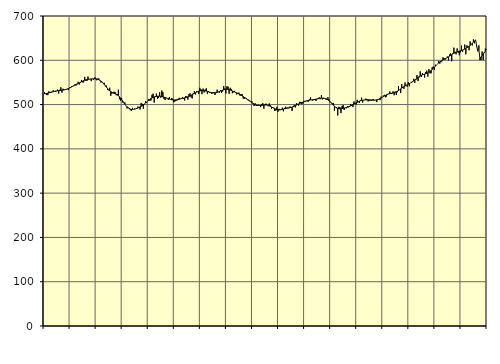
| Category | Piggar | Series 1 |
|---|---|---|
| nan | 527.8 | 524.2 |
| 87.0 | 525 | 524.54 |
| 87.0 | 521.6 | 525.27 |
| 87.0 | 521.3 | 525.8 |
| 87.0 | 529.9 | 526.46 |
| 87.0 | 526.2 | 527.11 |
| 87.0 | 528.8 | 527.82 |
| 87.0 | 528.1 | 528.49 |
| 87.0 | 532.4 | 529.15 |
| 87.0 | 529.6 | 529.76 |
| 87.0 | 528.7 | 530.31 |
| 87.0 | 530.2 | 530.78 |
| nan | 533.8 | 531.17 |
| 88.0 | 525 | 531.51 |
| 88.0 | 533.5 | 531.82 |
| 88.0 | 539 | 532.13 |
| 88.0 | 526.9 | 532.44 |
| 88.0 | 535.8 | 532.77 |
| 88.0 | 532.7 | 533.17 |
| 88.0 | 533 | 533.68 |
| 88.0 | 533.9 | 534.32 |
| 88.0 | 535.7 | 535.12 |
| 88.0 | 532.5 | 536.12 |
| 88.0 | 538.2 | 537.27 |
| nan | 538 | 538.55 |
| 89.0 | 541.4 | 539.95 |
| 89.0 | 542 | 541.36 |
| 89.0 | 543.3 | 542.73 |
| 89.0 | 545.7 | 544.05 |
| 89.0 | 542.9 | 545.33 |
| 89.0 | 545.6 | 546.55 |
| 89.0 | 551.4 | 547.77 |
| 89.0 | 545.3 | 549.01 |
| 89.0 | 549.2 | 550.3 |
| 89.0 | 555.5 | 551.61 |
| 89.0 | 550.1 | 552.89 |
| nan | 550.1 | 554.04 |
| 90.0 | 562.5 | 555.04 |
| 90.0 | 554 | 555.87 |
| 90.0 | 553.1 | 556.51 |
| 90.0 | 563.3 | 556.99 |
| 90.0 | 556.9 | 557.37 |
| 90.0 | 557.5 | 557.69 |
| 90.0 | 552.9 | 557.95 |
| 90.0 | 558.2 | 558.15 |
| 90.0 | 556.2 | 558.27 |
| 90.0 | 561.1 | 558.27 |
| 90.0 | 560.7 | 558.11 |
| nan | 554.9 | 557.75 |
| 91.0 | 558.5 | 557.08 |
| 91.0 | 559 | 556.07 |
| 91.0 | 554.4 | 554.71 |
| 91.0 | 549.8 | 552.96 |
| 91.0 | 551.2 | 550.79 |
| 91.0 | 548 | 548.25 |
| 91.0 | 549.2 | 545.45 |
| 91.0 | 541.4 | 542.47 |
| 91.0 | 542.8 | 539.37 |
| 91.0 | 533.1 | 536.35 |
| 91.0 | 532.2 | 533.58 |
| nan | 538.1 | 531.2 |
| 92.0 | 519.7 | 529.27 |
| 92.0 | 524.5 | 527.76 |
| 92.0 | 526 | 526.55 |
| 92.0 | 529.2 | 525.54 |
| 92.0 | 528.1 | 524.56 |
| 92.0 | 521.1 | 523.4 |
| 92.0 | 524 | 521.91 |
| 92.0 | 533.7 | 519.97 |
| 92.0 | 512 | 517.55 |
| 92.0 | 508.4 | 514.65 |
| 92.0 | 514.8 | 511.36 |
| nan | 504.7 | 507.81 |
| 93.0 | 505.4 | 504.2 |
| 93.0 | 504.5 | 500.78 |
| 93.0 | 497.8 | 497.67 |
| 93.0 | 491.2 | 494.97 |
| 93.0 | 493.8 | 492.78 |
| 93.0 | 490.1 | 491.1 |
| 93.0 | 487.4 | 489.9 |
| 93.0 | 485.8 | 489.17 |
| 93.0 | 492.7 | 488.92 |
| 93.0 | 489.2 | 489.12 |
| 93.0 | 490.9 | 489.66 |
| nan | 490.5 | 490.43 |
| 94.0 | 490.1 | 491.36 |
| 94.0 | 495.5 | 492.4 |
| 94.0 | 492 | 493.57 |
| 94.0 | 489 | 494.86 |
| 94.0 | 503.6 | 496.24 |
| 94.0 | 501.6 | 497.8 |
| 94.0 | 490.7 | 499.57 |
| 94.0 | 500.6 | 501.5 |
| 94.0 | 507.8 | 503.57 |
| 94.0 | 504.3 | 505.72 |
| 94.0 | 507.5 | 507.84 |
| nan | 512.7 | 509.88 |
| 95.0 | 508.4 | 511.79 |
| 95.0 | 509.4 | 513.47 |
| 95.0 | 522.1 | 514.91 |
| 95.0 | 524.7 | 516.16 |
| 95.0 | 504.5 | 517.2 |
| 95.0 | 519.1 | 518 |
| 95.0 | 524.9 | 518.61 |
| 95.0 | 513.1 | 519.01 |
| 95.0 | 514.9 | 519.15 |
| 95.0 | 527.8 | 519.02 |
| 95.0 | 515.6 | 518.65 |
| nan | 531.8 | 518.11 |
| 96.0 | 528.2 | 517.47 |
| 96.0 | 513 | 516.76 |
| 96.0 | 510.2 | 515.99 |
| 96.0 | 515.4 | 515.12 |
| 96.0 | 513.9 | 514.21 |
| 96.0 | 510.5 | 513.34 |
| 96.0 | 516.9 | 512.48 |
| 96.0 | 512.1 | 511.68 |
| 96.0 | 514.1 | 511.05 |
| 96.0 | 513.6 | 510.62 |
| 96.0 | 505.3 | 510.36 |
| nan | 506.9 | 510.31 |
| 97.0 | 508.5 | 510.46 |
| 97.0 | 509.6 | 510.78 |
| 97.0 | 512.9 | 511.25 |
| 97.0 | 515.2 | 511.86 |
| 97.0 | 513.1 | 512.59 |
| 97.0 | 514.6 | 513.37 |
| 97.0 | 516.7 | 514.09 |
| 97.0 | 512.6 | 514.72 |
| 97.0 | 509.1 | 515.28 |
| 97.0 | 519.1 | 515.82 |
| 97.0 | 518.5 | 516.48 |
| nan | 511.2 | 517.3 |
| 98.0 | 523.4 | 518.28 |
| 98.0 | 525.3 | 519.46 |
| 98.0 | 516.4 | 520.79 |
| 98.0 | 513.9 | 522.24 |
| 98.0 | 525.7 | 523.73 |
| 98.0 | 530.4 | 525.2 |
| 98.0 | 522.9 | 526.61 |
| 98.0 | 530.3 | 527.94 |
| 98.0 | 528.6 | 529.16 |
| 98.0 | 524.4 | 530.21 |
| 98.0 | 537.8 | 531.02 |
| nan | 534.7 | 531.56 |
| 99.0 | 523.6 | 531.8 |
| 99.0 | 536.1 | 531.75 |
| 99.0 | 527.3 | 531.48 |
| 99.0 | 533.9 | 531.03 |
| 99.0 | 536.6 | 530.41 |
| 99.0 | 524.1 | 529.64 |
| 99.0 | 530.7 | 528.8 |
| 99.0 | 526.6 | 528.02 |
| 99.0 | 528.4 | 527.36 |
| 99.0 | 523.9 | 526.86 |
| 99.0 | 527.8 | 526.52 |
| nan | 528 | 526.42 |
| 0.0 | 521.6 | 526.58 |
| 0.0 | 525.6 | 526.98 |
| 0.0 | 533.8 | 527.62 |
| 0.0 | 528.8 | 528.46 |
| 0.0 | 526.8 | 529.4 |
| 0.0 | 531.9 | 530.43 |
| 0.0 | 526.8 | 531.52 |
| 0.0 | 529.4 | 532.55 |
| 0.0 | 541.6 | 533.44 |
| 0.0 | 536.3 | 534.12 |
| 0.0 | 525 | 534.53 |
| nan | 541.4 | 534.61 |
| 1.0 | 540.4 | 534.37 |
| 1.0 | 524.3 | 533.82 |
| 1.0 | 537.9 | 532.96 |
| 1.0 | 534.9 | 531.9 |
| 1.0 | 525.6 | 530.76 |
| 1.0 | 527.6 | 529.63 |
| 1.0 | 530.9 | 528.52 |
| 1.0 | 528.1 | 527.43 |
| 1.0 | 522.7 | 526.31 |
| 1.0 | 525.5 | 525.12 |
| 1.0 | 527.1 | 523.86 |
| nan | 520.3 | 522.51 |
| 2.0 | 523.7 | 521.04 |
| 2.0 | 523.5 | 519.5 |
| 2.0 | 513.4 | 517.93 |
| 2.0 | 513.1 | 516.29 |
| 2.0 | 515.2 | 514.63 |
| 2.0 | 514.6 | 512.97 |
| 2.0 | 510 | 511.26 |
| 2.0 | 510.9 | 509.53 |
| 2.0 | 508.9 | 507.79 |
| 2.0 | 506.2 | 506.04 |
| 2.0 | 507.2 | 504.34 |
| nan | 501.4 | 502.74 |
| 3.0 | 496.8 | 501.28 |
| 3.0 | 502.7 | 500.01 |
| 3.0 | 496.9 | 499.03 |
| 3.0 | 497.1 | 498.35 |
| 3.0 | 499.6 | 497.97 |
| 3.0 | 498.8 | 497.86 |
| 3.0 | 494.2 | 497.97 |
| 3.0 | 500.8 | 498.24 |
| 3.0 | 503.2 | 498.58 |
| 3.0 | 490.8 | 498.92 |
| 3.0 | 499.9 | 499.11 |
| nan | 502.3 | 499.09 |
| 4.0 | 498.9 | 498.8 |
| 4.0 | 496.2 | 498.21 |
| 4.0 | 502.6 | 497.31 |
| 4.0 | 498 | 496.14 |
| 4.0 | 490.4 | 494.78 |
| 4.0 | 494.4 | 493.34 |
| 4.0 | 493.3 | 491.92 |
| 4.0 | 485.5 | 490.6 |
| 4.0 | 486.7 | 489.48 |
| 4.0 | 494.9 | 488.67 |
| 4.0 | 483.5 | 488.21 |
| nan | 490.4 | 488.07 |
| 5.0 | 487.4 | 488.26 |
| 5.0 | 487.8 | 488.72 |
| 5.0 | 493 | 489.31 |
| 5.0 | 484.9 | 489.94 |
| 5.0 | 492.5 | 490.55 |
| 5.0 | 495.1 | 491.08 |
| 5.0 | 492.8 | 491.55 |
| 5.0 | 493.3 | 491.97 |
| 5.0 | 491.9 | 492.4 |
| 5.0 | 495.7 | 492.87 |
| 5.0 | 492.8 | 493.46 |
| nan | 485.6 | 494.23 |
| 6.0 | 496.5 | 495.15 |
| 6.0 | 499.2 | 496.24 |
| 6.0 | 493.6 | 497.46 |
| 6.0 | 502.9 | 498.79 |
| 6.0 | 501.6 | 500.16 |
| 6.0 | 497.8 | 501.44 |
| 6.0 | 506.3 | 502.57 |
| 6.0 | 506 | 503.6 |
| 6.0 | 500.9 | 504.54 |
| 6.0 | 502.6 | 505.44 |
| 6.0 | 508.2 | 506.34 |
| nan | 508.4 | 507.26 |
| 7.0 | 508.3 | 508.16 |
| 7.0 | 507.2 | 508.94 |
| 7.0 | 506.7 | 509.58 |
| 7.0 | 512.4 | 510.07 |
| 7.0 | 516.8 | 510.41 |
| 7.0 | 510.3 | 510.7 |
| 7.0 | 508.9 | 510.98 |
| 7.0 | 510.3 | 511.28 |
| 7.0 | 510.4 | 511.68 |
| 7.0 | 508.1 | 512.16 |
| 7.0 | 512.4 | 512.67 |
| nan | 514.9 | 513.19 |
| 8.0 | 516.2 | 513.71 |
| 8.0 | 512 | 514.18 |
| 8.0 | 521.4 | 514.51 |
| 8.0 | 511.8 | 514.68 |
| 8.0 | 513.2 | 514.59 |
| 8.0 | 514.7 | 514.18 |
| 8.0 | 511.6 | 513.45 |
| 8.0 | 510.3 | 512.36 |
| 8.0 | 516.8 | 510.85 |
| 8.0 | 511.9 | 508.99 |
| 8.0 | 504.9 | 506.77 |
| nan | 504.7 | 504.22 |
| 9.0 | 503.1 | 501.49 |
| 9.0 | 503.6 | 498.76 |
| 9.0 | 486.3 | 496.23 |
| 9.0 | 494.5 | 494.04 |
| 9.0 | 494.2 | 492.36 |
| 9.0 | 475.3 | 491.23 |
| 9.0 | 494.9 | 490.61 |
| 9.0 | 494.4 | 490.44 |
| 9.0 | 480.8 | 490.62 |
| 9.0 | 497 | 491.01 |
| 9.0 | 498.8 | 491.55 |
| nan | 487.7 | 492.18 |
| 10.0 | 492.2 | 492.84 |
| 10.0 | 491.6 | 493.53 |
| 10.0 | 496.5 | 494.29 |
| 10.0 | 493.8 | 495.19 |
| 10.0 | 495 | 496.16 |
| 10.0 | 501.4 | 497.26 |
| 10.0 | 497.4 | 498.49 |
| 10.0 | 494.4 | 499.8 |
| 10.0 | 507.1 | 501.17 |
| 10.0 | 501.3 | 502.56 |
| 10.0 | 499.9 | 503.88 |
| nan | 510.7 | 505.16 |
| 11.0 | 505.3 | 506.39 |
| 11.0 | 503.7 | 507.5 |
| 11.0 | 509.6 | 508.46 |
| 11.0 | 515.6 | 509.23 |
| 11.0 | 504.7 | 509.81 |
| 11.0 | 510.4 | 510.23 |
| 11.0 | 510.2 | 510.52 |
| 11.0 | 513.5 | 510.71 |
| 11.0 | 512.1 | 510.81 |
| 11.0 | 507.2 | 510.8 |
| 11.0 | 508.4 | 510.71 |
| nan | 509.5 | 510.54 |
| 12.0 | 508.8 | 510.31 |
| 12.0 | 511.9 | 510.08 |
| 12.0 | 512.2 | 509.93 |
| 12.0 | 509.2 | 509.93 |
| 12.0 | 510.5 | 510.15 |
| 12.0 | 505.6 | 510.63 |
| 12.0 | 511.9 | 511.32 |
| 12.0 | 512.3 | 512.23 |
| 12.0 | 510 | 513.34 |
| 12.0 | 517.9 | 514.63 |
| 12.0 | 516.3 | 516.1 |
| nan | 520.3 | 517.65 |
| 13.0 | 522 | 519.21 |
| 13.0 | 516.4 | 520.72 |
| 13.0 | 518.1 | 522.01 |
| 13.0 | 524 | 523.05 |
| 13.0 | 524.5 | 523.91 |
| 13.0 | 529.5 | 524.6 |
| 13.0 | 526.3 | 525.18 |
| 13.0 | 524.9 | 525.74 |
| 13.0 | 529.9 | 526.31 |
| 13.0 | 521.2 | 526.98 |
| 13.0 | 529.3 | 527.83 |
| nan | 521.5 | 528.88 |
| 14.0 | 527.9 | 530.2 |
| 14.0 | 542 | 531.79 |
| 14.0 | 533.7 | 533.6 |
| 14.0 | 526 | 535.49 |
| 14.0 | 546.4 | 537.32 |
| 14.0 | 537.8 | 539.04 |
| 14.0 | 535.5 | 540.61 |
| 14.0 | 549.8 | 542.03 |
| 14.0 | 542.7 | 543.35 |
| 14.0 | 540.3 | 544.65 |
| 14.0 | 551 | 545.94 |
| nan | 541.3 | 547.27 |
| 15.0 | 548.8 | 548.68 |
| 15.0 | 551.2 | 550.16 |
| 15.0 | 552.8 | 551.79 |
| 15.0 | 558.2 | 553.59 |
| 15.0 | 549 | 555.48 |
| 15.0 | 555.6 | 557.41 |
| 15.0 | 566.5 | 559.33 |
| 15.0 | 553.1 | 561.17 |
| 15.0 | 561.1 | 562.88 |
| 15.0 | 574.9 | 564.44 |
| 15.0 | 562.4 | 565.79 |
| nan | 571.2 | 566.94 |
| 16.0 | 567.3 | 567.95 |
| 16.0 | 561 | 568.84 |
| 16.0 | 573.4 | 569.7 |
| 16.0 | 576.6 | 570.63 |
| 16.0 | 563.1 | 571.76 |
| 16.0 | 580.1 | 573.21 |
| 16.0 | 570.5 | 574.98 |
| 16.0 | 570.6 | 577.05 |
| 16.0 | 584 | 579.35 |
| 16.0 | 585.8 | 581.79 |
| 16.0 | 578.4 | 584.29 |
| nan | 590.1 | 586.81 |
| 17.0 | 589.3 | 589.33 |
| 17.0 | 591.8 | 591.77 |
| 17.0 | 598.5 | 594.04 |
| 17.0 | 592.4 | 596.11 |
| 17.0 | 595.5 | 598 |
| 17.0 | 597.8 | 599.66 |
| 17.0 | 606.6 | 601.07 |
| 17.0 | 605.1 | 602.36 |
| 17.0 | 601.4 | 603.57 |
| 17.0 | 604.7 | 604.78 |
| 17.0 | 608.5 | 606.13 |
| nan | 599.7 | 607.68 |
| 18.0 | 613 | 609.32 |
| 18.0 | 615.4 | 611.01 |
| 18.0 | 597.8 | 612.7 |
| 18.0 | 615.7 | 614.29 |
| 18.0 | 628.5 | 615.8 |
| 18.0 | 619.2 | 617.15 |
| 18.0 | 613.4 | 618.28 |
| 18.0 | 626.7 | 619.22 |
| 18.0 | 617.1 | 619.99 |
| 18.0 | 611.5 | 620.67 |
| 18.0 | 617.7 | 621.35 |
| nan | 633.1 | 622.1 |
| 19.0 | 619 | 623 |
| 19.0 | 623.5 | 624.08 |
| 19.0 | 635.6 | 625.38 |
| 19.0 | 613.5 | 626.89 |
| 19.0 | 633.8 | 628.44 |
| 19.0 | 631.6 | 630.03 |
| 19.0 | 622.7 | 631.79 |
| 19.0 | 642.6 | 633.72 |
| 19.0 | 635.4 | 635.89 |
| 19.0 | 633.6 | 638.32 |
| 19.0 | 647.2 | 640.92 |
| nan | 638.5 | 643.57 |
| 20.0 | 646.3 | 646.24 |
| 20.0 | 631 | 631.78 |
| 20.0 | 620.2 | 620.92 |
| 20.0 | 633.7 | 623.81 |
| 20.0 | 600.3 | 603.98 |
| 20.0 | 600.7 | 607.18 |
| 20.0 | 619.8 | 610.51 |
| 20.0 | 600.3 | 613.93 |
| 20.0 | 618.6 | 617.33 |
| 20.0 | 626.6 | 620.7 |
| 20.0 | 625.2 | 623.98 |